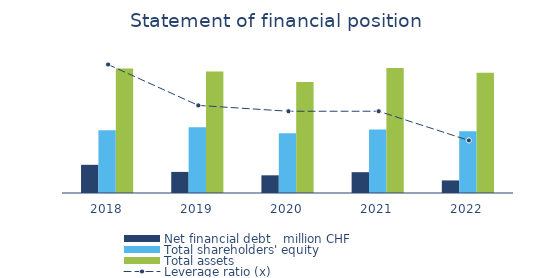
| Category | Net financial debt   | Total shareholders' equity   | Total assets   |
|---|---|---|---|
| 2018.0 | 13518 | 30053 | 59695 |
| 2019.0 | 10110 | 31499 | 58310 |
| 2020.0 | 8483 | 28625 | 53224 |
| 2021.0 | 9977 | 30473 | 59885 |
| 2022.0 | 6032 | 29614 | 57603 |